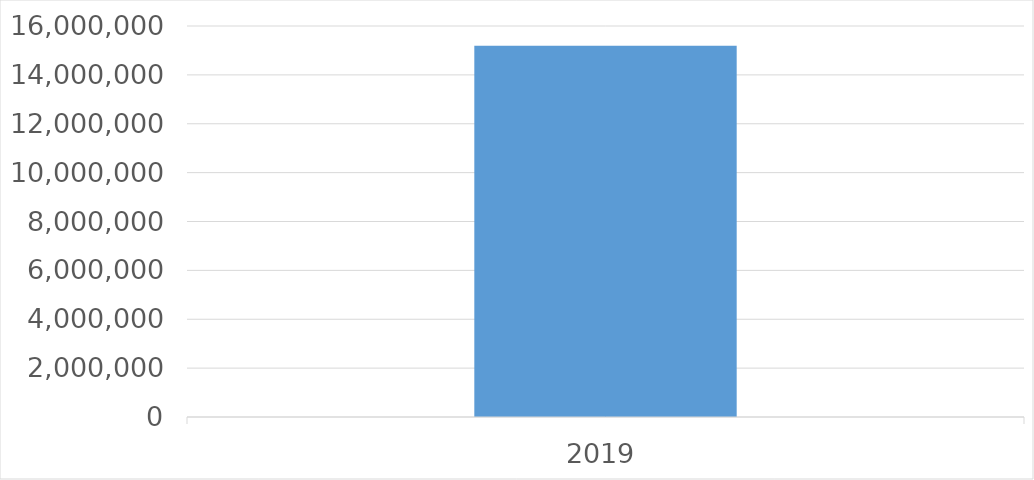
| Category | Series 0 |
|---|---|
| 2019 | 15191931 |